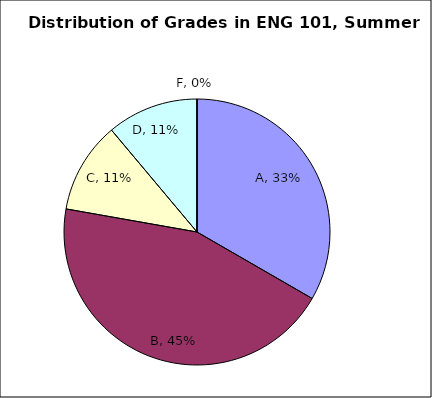
| Category | Distribution |
|---|---|
| A | 3 |
| B | 4 |
| C | 1 |
| D | 1 |
| F | 0 |